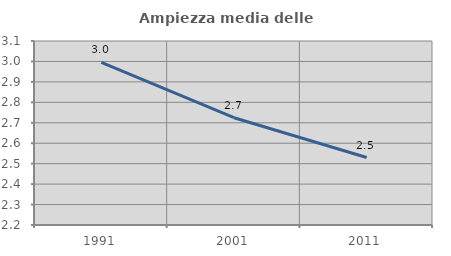
| Category | Ampiezza media delle famiglie |
|---|---|
| 1991.0 | 2.995 |
| 2001.0 | 2.725 |
| 2011.0 | 2.53 |